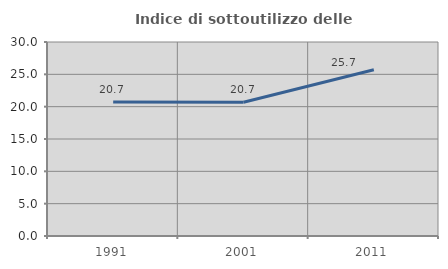
| Category | Indice di sottoutilizzo delle abitazioni  |
|---|---|
| 1991.0 | 20.725 |
| 2001.0 | 20.69 |
| 2011.0 | 25.714 |